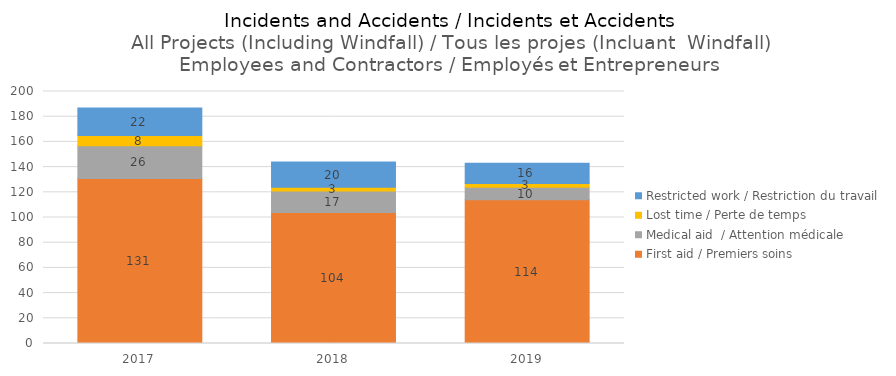
| Category | First aid / Premiers soins | Medical aid  / Attention médicale | Lost time / Perte de temps | Restricted work / Restriction du travail |
|---|---|---|---|---|
| 2017.0 | 131 | 26 | 8 | 22 |
| 2018.0 | 104 | 17 | 3 | 20 |
| 2019.0 | 114 | 10 | 3 | 16 |